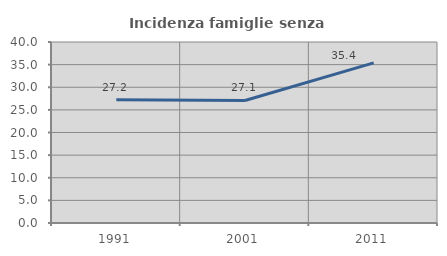
| Category | Incidenza famiglie senza nuclei |
|---|---|
| 1991.0 | 27.216 |
| 2001.0 | 27.074 |
| 2011.0 | 35.38 |